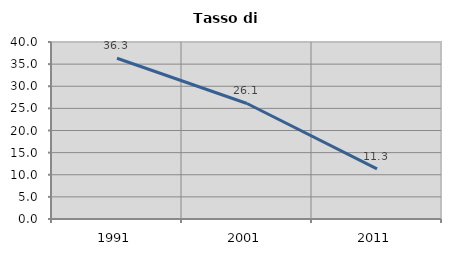
| Category | Tasso di disoccupazione   |
|---|---|
| 1991.0 | 36.335 |
| 2001.0 | 26.104 |
| 2011.0 | 11.319 |